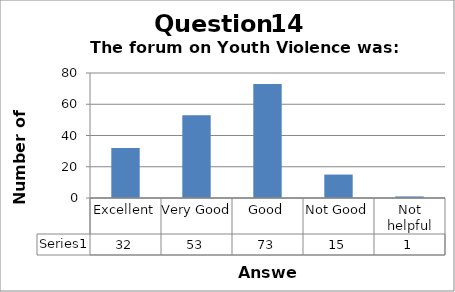
| Category | Series 0 |
|---|---|
| Excellent | 32 |
| Very Good | 53 |
| Good | 73 |
| Not Good | 15 |
| Not helpful | 1 |